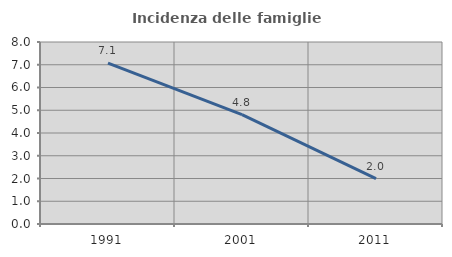
| Category | Incidenza delle famiglie numerose |
|---|---|
| 1991.0 | 7.074 |
| 2001.0 | 4.808 |
| 2011.0 | 1.993 |